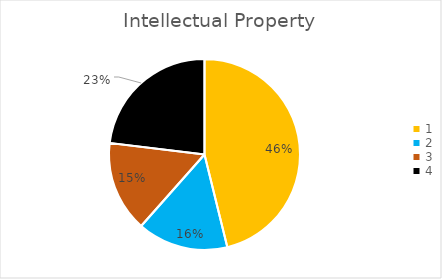
| Category | Series 0 |
|---|---|
| 0 | 0.462 |
| 1 | 0.154 |
| 2 | 0.154 |
| 3 | 0.231 |